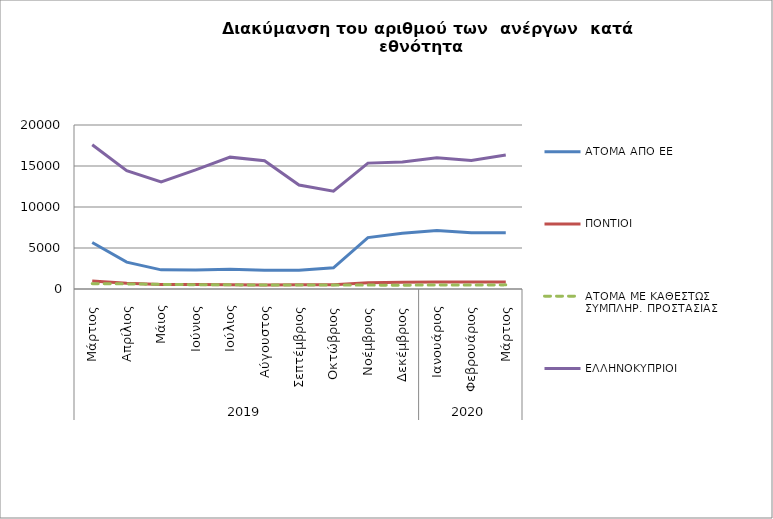
| Category | ΑΤΟΜΑ ΑΠΟ ΕΕ | ΠΟΝΤΙΟΙ | ΑΤΟΜΑ ΜΕ ΚΑΘΕΣΤΩΣ ΣΥΜΠΛΗΡ. ΠΡΟΣΤΑΣΙΑΣ | ΕΛΛΗΝΟΚΥΠΡΙΟΙ |
|---|---|---|---|---|
| 0 | 5678 | 963 | 655 | 17591 |
| 1 | 3279 | 709 | 623 | 14429 |
| 2 | 2334 | 556 | 567 | 13066 |
| 3 | 2332 | 537 | 525 | 14520 |
| 4 | 2405 | 513 | 509 | 16081 |
| 5 | 2278 | 474 | 486 | 15644 |
| 6 | 2278 | 504 | 497 | 12674 |
| 7 | 2586 | 518 | 475 | 11921 |
| 8 | 6266 | 775 | 476 | 15352 |
| 9 | 6810 | 834 | 465 | 15490 |
| 10 | 7137 | 866 | 490 | 15998 |
| 11 | 6870 | 843 | 480 | 15686 |
| 12 | 6874 | 847 | 504 | 16354 |